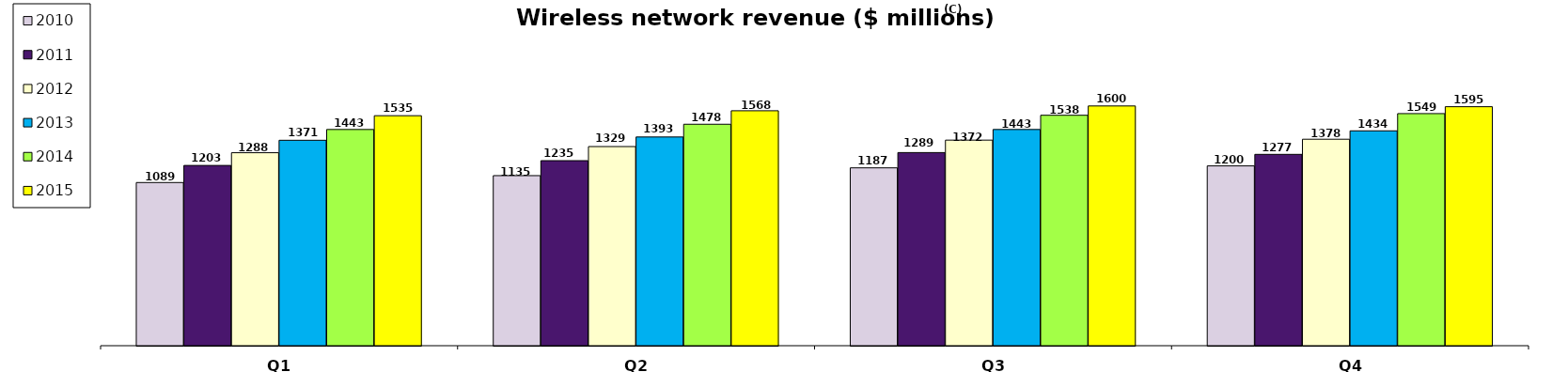
| Category | 2010 | 2011 | 2012 | 2013 | 2014 | 2015 |
|---|---|---|---|---|---|---|
| Q1 | 1089 | 1203 | 1288 | 1371 | 1443 | 1535 |
| Q2 | 1135 | 1235 | 1329 | 1393 | 1478 | 1568 |
| Q3 | 1187 | 1289 | 1372 | 1443 | 1538 | 1600 |
| Q4 | 1200 | 1277 | 1378 | 1434 | 1549 | 1595 |